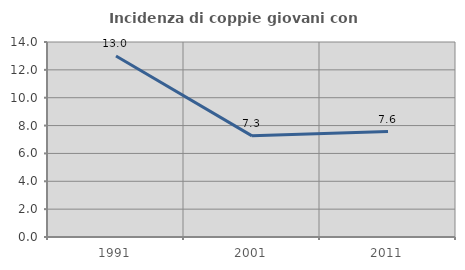
| Category | Incidenza di coppie giovani con figli |
|---|---|
| 1991.0 | 13 |
| 2001.0 | 7.261 |
| 2011.0 | 7.571 |